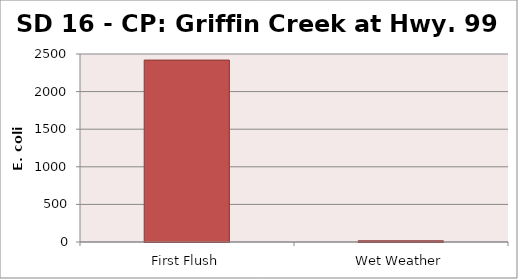
| Category | E. coli MPN - |
|---|---|
| First Flush | 2419.2 |
| Wet Weather | 16.1 |